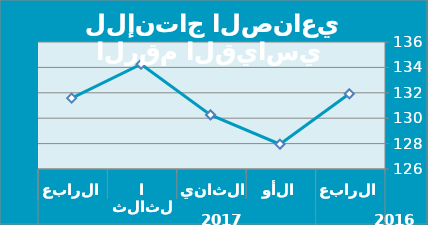
| Category | Series 0 |
|---|---|
| 0 | 131.92 |
| 1 | 127.95 |
| 2 | 130.26 |
| 3 | 134.25 |
| 4 | 131.58 |